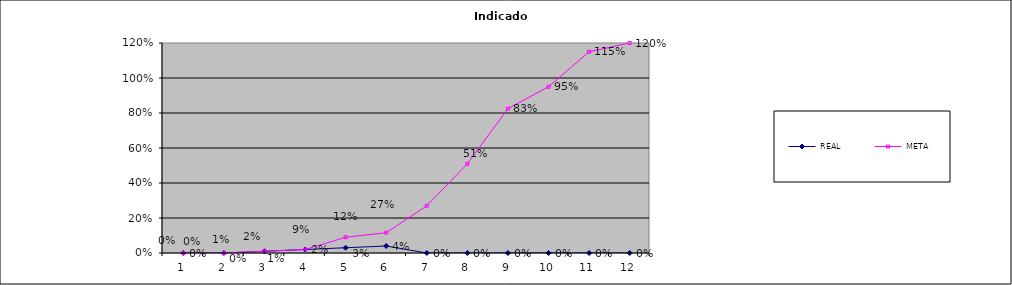
| Category | REAL | META |
|---|---|---|
| 0 | 0 | 0 |
| 1 | 0 | 0 |
| 2 | 0.01 | 0.01 |
| 3 | 0.02 | 0.02 |
| 4 | 0.03 | 0.09 |
| 5 | 0.04 | 0.116 |
| 6 | 0 | 0.27 |
| 7 | 0 | 0.51 |
| 8 | 0 | 0.825 |
| 9 | 0 | 0.95 |
| 10 | 0 | 1.15 |
| 11 | 0 | 1.2 |